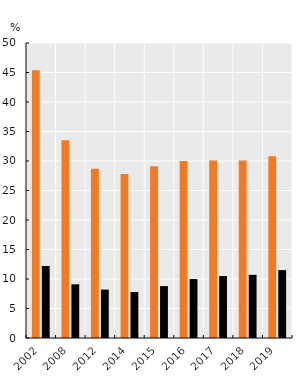
| Category | Poverty | Extreme Poverty |
|---|---|---|
| 2002.0 | 45.4 | 12.2 |
| 2008.0 | 33.5 | 9.1 |
| 2012.0 | 28.7 | 8.2 |
| 2014.0 | 27.8 | 7.8 |
| 2015.0 | 29.1 | 8.8 |
| 2016.0 | 30 | 10 |
| 2017.0 | 30.1 | 10.5 |
| 2018.0 | 30.1 | 10.7 |
| 2019.0 | 30.8 | 11.5 |